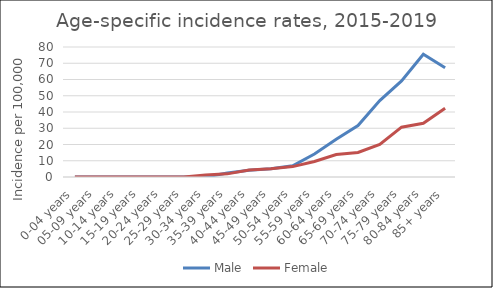
| Category | Male | Female |
|---|---|---|
| 0-04 years | 0 | 0 |
| 05-09 years | 0 | 0 |
| 10-14 years | 0 | 0 |
| 15-19 years | 0 | 0 |
| 20-24 years | 0 | 0 |
| 25-29 years | 0 | 0 |
| 30-34 years | 0 | 1.18 |
| 35-39 years | 2.43 | 1.93 |
| 40-44 years | 4.22 | 4.31 |
| 45-49 years | 5.02 | 5.13 |
| 50-54 years | 6.86 | 6.4 |
| 55-59 years | 14.17 | 9.54 |
| 60-64 years | 23.18 | 13.85 |
| 65-69 years | 31.67 | 15.08 |
| 70-74 years | 47.03 | 20.09 |
| 75-79 years | 59.11 | 30.66 |
| 80-84 years | 75.58 | 33.06 |
| 85+ years | 67.26 | 42.33 |